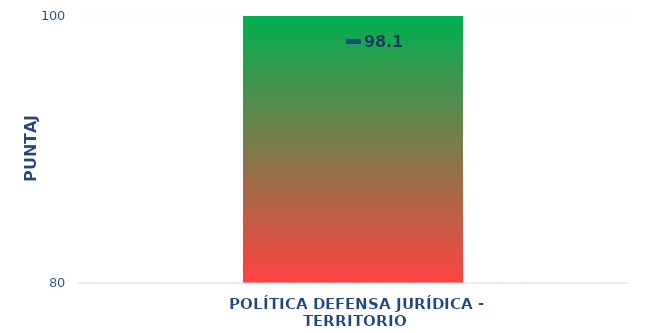
| Category | Niveles |
|---|---|
| POLÍTICA DEFENSA JURÍDICA - TERRITORIO | 100 |